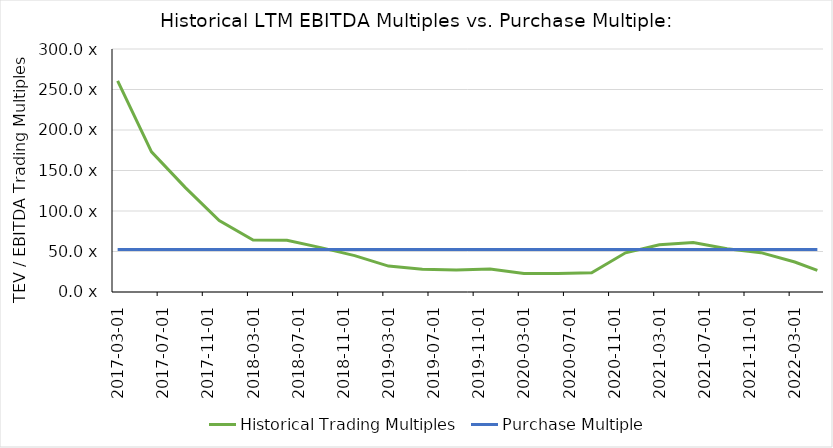
| Category | Historical Trading Multiples | Purchase Multiple |
|---|---|---|
| 2017-03-31 | 260.526 | 52.443 |
| 2017-06-30 | 173.077 | 52.443 |
| 2017-09-29 | 128.921 | 52.443 |
| 2017-12-29 | 88.28 | 52.443 |
| 2018-03-29 | 64.209 | 52.443 |
| 2018-06-29 | 63.998 | 52.443 |
| 2018-09-28 | 54.777 | 52.443 |
| 2018-12-28 | 44.927 | 52.443 |
| 2019-03-29 | 31.955 | 52.443 |
| 2019-06-28 | 28.199 | 52.443 |
| 2019-09-30 | 27.067 | 52.443 |
| 2019-12-31 | 28.505 | 52.443 |
| 2020-03-31 | 22.809 | 52.443 |
| 2020-06-30 | 22.947 | 52.443 |
| 2020-09-30 | 23.625 | 52.443 |
| 2020-12-31 | 48.374 | 52.443 |
| 2021-03-31 | 58.409 | 52.443 |
| 2021-06-30 | 61.106 | 52.443 |
| 2021-09-30 | 53.302 | 52.443 |
| 2021-12-31 | 48.552 | 52.443 |
| 2022-03-31 | 37.045 | 52.443 |
| 2022-05-02 | 26.618 | 52.443 |